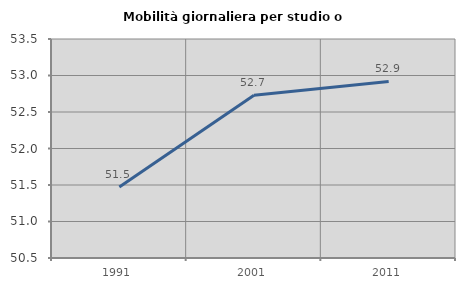
| Category | Mobilità giornaliera per studio o lavoro |
|---|---|
| 1991.0 | 51.474 |
| 2001.0 | 52.73 |
| 2011.0 | 52.919 |